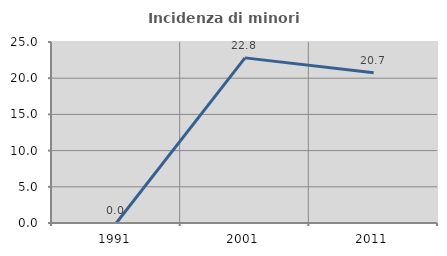
| Category | Incidenza di minori stranieri |
|---|---|
| 1991.0 | 0 |
| 2001.0 | 22.807 |
| 2011.0 | 20.741 |